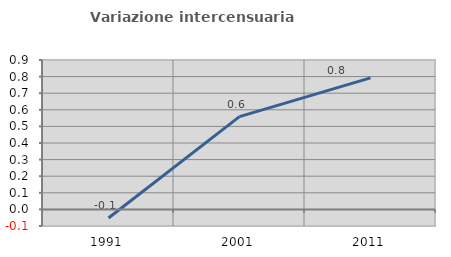
| Category | Variazione intercensuaria annua |
|---|---|
| 1991.0 | -0.052 |
| 2001.0 | 0.559 |
| 2011.0 | 0.792 |